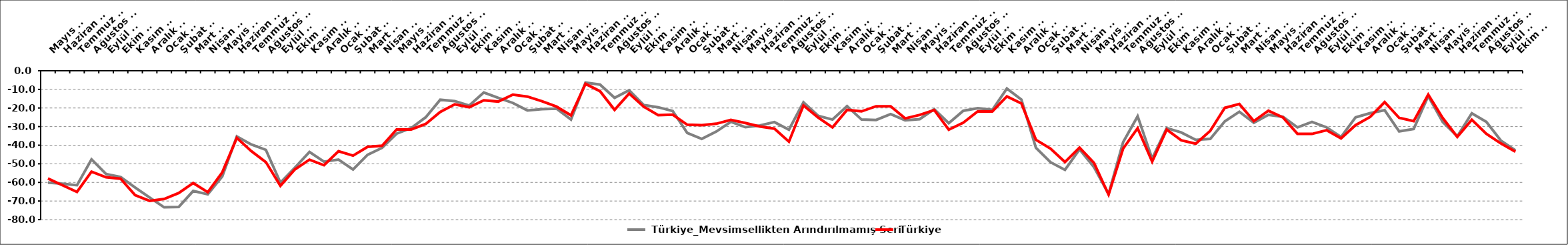
| Category |  Türkiye_Mevsimsellikten Arındırılmamış Seri |  Türkiye |
|---|---|---|
| 2008-05-01 | -60.1 | -57.89 |
| 2008-06-01 | -60.7 | -61.518 |
| 2008-07-01 | -61.5 | -65.11 |
| 2008-08-01 | -47.6 | -54.198 |
| 2008-09-01 | -55.5 | -57.226 |
| 2008-10-01 | -57.1 | -58.004 |
| 2008-11-01 | -62.7 | -66.848 |
| 2008-12-01 | -68.1 | -69.948 |
| 2009-01-01 | -73.4 | -68.882 |
| 2009-02-01 | -73.2 | -65.71 |
| 2009-03-01 | -64.6 | -60.338 |
| 2009-04-01 | -66.4 | -65.237 |
| 2009-05-01 | -56.8 | -54.579 |
| 2009-06-01 | -35.3 | -36.103 |
| 2009-07-01 | -39.6 | -43.215 |
| 2009-08-01 | -42.5 | -49.073 |
| 2009-09-01 | -60.1 | -61.822 |
| 2009-10-01 | -52.1 | -52.996 |
| 2009-11-01 | -43.6 | -47.766 |
| 2009-12-01 | -48.883 | -50.766 |
| 2010-01-01 | -47.73 | -43.238 |
| 2010-02-01 | -53.1 | -45.632 |
| 2010-03-01 | -45.17 | -40.91 |
| 2010-04-01 | -41.41 | -40.266 |
| 2010-05-01 | -33.8 | -31.551 |
| 2010-06-01 | -30.8 | -31.539 |
| 2010-07-01 | -24.991 | -28.582 |
| 2010-08-01 | -15.581 | -22.109 |
| 2010-09-01 | -16.3 | -18.034 |
| 2010-10-01 | -18.678 | -19.573 |
| 2010-11-01 | -11.69 | -15.879 |
| 2010-12-01 | -14.6 | -16.536 |
| 2011-01-01 | -17.299 | -12.839 |
| 2011-02-01 | -21.3 | -13.867 |
| 2011-03-01 | -20.6 | -16.351 |
| 2011-04-01 | -20.36 | -19.256 |
| 2011-05-01 | -26.239 | -23.968 |
| 2011-06-01 | -6.376 | -7.03 |
| 2011-07-01 | -7.436 | -10.994 |
| 2011-08-01 | -14.519 | -20.995 |
| 2011-09-01 | -10.495 | -12.232 |
| 2011-10-01 | -18.373 | -19.263 |
| 2011-11-01 | -19.611 | -23.815 |
| 2011-12-01 | -21.606 | -23.595 |
| 2012-01-01 | -33.432 | -28.996 |
| 2012-02-01 | -36.594 | -29.198 |
| 2012-03-01 | -32.692 | -28.46 |
| 2012-04-01 | -27.439 | -26.389 |
| 2012-05-01 | -30.327 | -28.052 |
| 2012-06-01 | -29.396 | -29.947 |
| 2012-07-01 | -27.595 | -31.107 |
| 2012-08-01 | -31.639 | -38.074 |
| 2012-09-01 | -16.962 | -18.674 |
| 2012-10-01 | -24.159 | -25.038 |
| 2012-11-01 | -26.211 | -30.436 |
| 2012-12-01 | -19.009 | -21.049 |
| 2013-01-01 | -26.224 | -21.82 |
| 2013-02-01 | -26.445 | -19.091 |
| 2013-03-02 | -23.3 | -19.087 |
| 2013-04-02 | -26.6 | -25.607 |
| 2013-05-02 | -26.003 | -23.734 |
| 2013-06-02 | -20.681 | -21.126 |
| 2013-07-02 | -28.17 | -31.649 |
| 2013-08-02 | -21.518 | -27.944 |
| 2013-09-02 | -20.118 | -21.78 |
| 2013-10-02 | -21 | -21.863 |
| 2013-11-02 | -9.522 | -13.77 |
| 2013-12-02 | -15.514 | -17.587 |
| 2014-01-02 | -41.442 | -37.071 |
| 2014-02-02 | -49.135 | -41.82 |
| 2014-03-02 | -53.244 | -49.05 |
| 2014-04-02 | -42.234 | -41.302 |
| 2014-05-02 | -51.814 | -49.556 |
| 2014-06-02 | -66.184 | -66.54 |
| 2014-07-02 | -38.392 | -41.855 |
| 2014-08-02 | -24.472 | -30.893 |
| 2014-09-02 | -47.205 | -48.802 |
| 2014-10-02 | -30.796 | -31.613 |
| 2014-11-02 | -33.13 | -37.36 |
| 2014-12-02 | -37.11 | -39.177 |
| 2015-01-02 | -36.602 | -32.266 |
| 2015-02-02 | -27.187 | -19.913 |
| 2015-03-02 | -22.04 | -17.883 |
| 2015-04-02 | -27.908 | -27.053 |
| 2015-05-02 | -23.708 | -21.488 |
| 2015-06-02 | -24.735 | -25.061 |
| 2015-07-02 | -30.407 | -33.874 |
| 2015-08-02 | -27.53 | -33.935 |
| 2015-09-02 | -30.402 | -31.953 |
| 2015-10-02 | -35.557 | -36.318 |
| 2015-11-02 | -25.008 | -29.21 |
| 2015-12-02 | -22.774 | -24.831 |
| 2016-01-02 | -21.175 | -16.862 |
| 2016-02-02 | -32.575 | -25.311 |
| 2016-03-02 | -31.255 | -27.109 |
| 2016-04-02 | -13.61 | -12.806 |
| 2016-05-02 | -27.58 | -25.381 |
| 2016-06-02 | -35.228 | -35.545 |
| 2016-07-03 | -22.838 | -26.32 |
| 2016-08-03 | -27.474 | -33.876 |
| 2016-09-03 | -37.514 | -39.052 |
| 2016-10-03 | -42.741 | -43.474 |